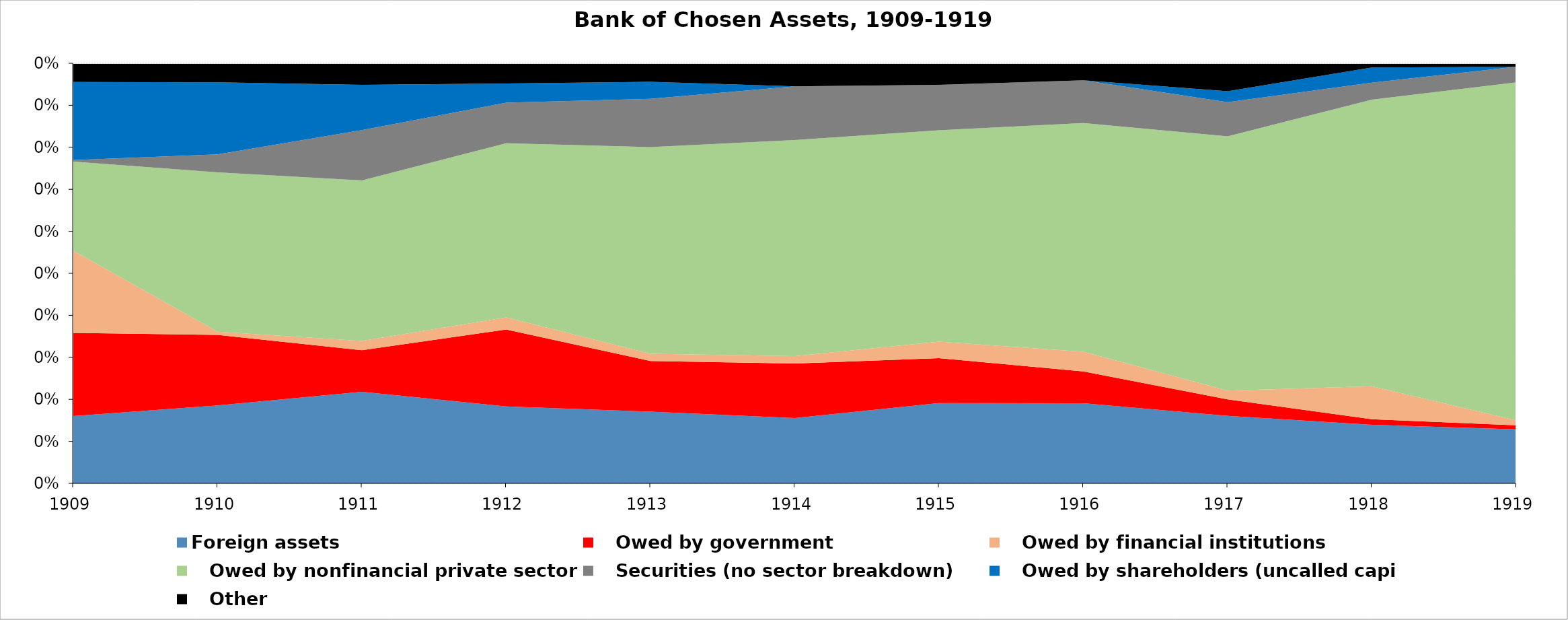
| Category | Foreign assets |    Owed by government |    Owed by financial institutions |    Owed by nonfinancial private sector |    Securities (no sector breakdown) |    Owed by shareholders (uncalled capital) |    Other |
|---|---|---|---|---|---|---|---|
| 1909.0 | 6475679 | 7979910 | 7895062 | 8579146 | 150000 | 7500000 | 1796680 |
| 1910.0 | 8101997 | 7329354 | 333284 | 16583846 | 1865245 | 7500000 | 1970306 |
| 1911.0 | 10119399 | 4594677 | 1018163 | 17748391 | 5549317 | 5000000 | 2387347 |
| 1912.0 | 10089919 | 10094677 | 1588859 | 22834185 | 5342232 | 2500000 | 2655513 |
| 1913.0 | 10614192 | 7500000 | 1057514 | 30586644 | 7149229 | 2500000 | 2747463 |
| 1914.0 | 8988147 | 7500000 | 1017756 | 29742464 | 7383381 | 0 | 3167946 |
| 1915.0 | 13412722 | 7500000 | 2747934 | 35294403 | 7591176 | 0 | 3597985 |
| 1916.0 | 18882546 | 7500000 | 4603056 | 53882437 | 10078513 | 0 | 4009130 |
| 1917.0 | 30744410 | 7500000 | 3936045 | 115724258 | 15537153 | 5000000 | 12719851 |
| 1918.0 | 57553548 | 5500000 | 32502408 | 281718487 | 16720198 | 15000000 | 4066494 |
| 1919.0 | 75926360 | 5500000 | 7119503 | 474660749 | 21911108 | 55000 | 4894644 |